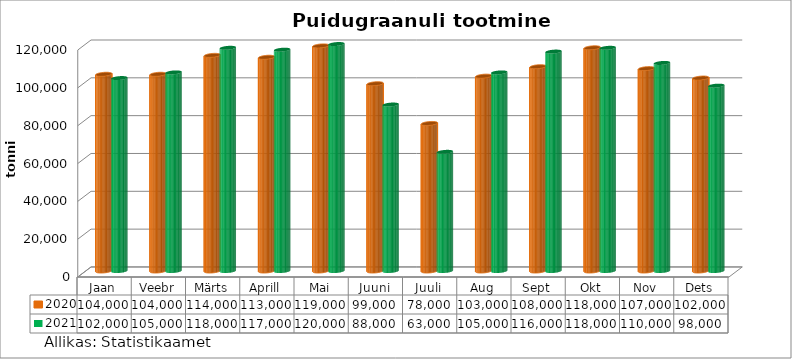
| Category | 2020 | 2021 |
|---|---|---|
| Jaan | 104000 | 102000 |
| Veebr | 104000 | 105000 |
| Märts | 114000 | 118000 |
| Aprill | 113000 | 117000 |
| Mai | 119000 | 120000 |
| Juuni | 99000 | 88000 |
| Juuli | 78000 | 63000 |
| Aug | 103000 | 105000 |
| Sept | 108000 | 116000 |
| Okt | 118000 | 118000 |
| Nov | 107000 | 110000 |
| Dets | 102000 | 98000 |